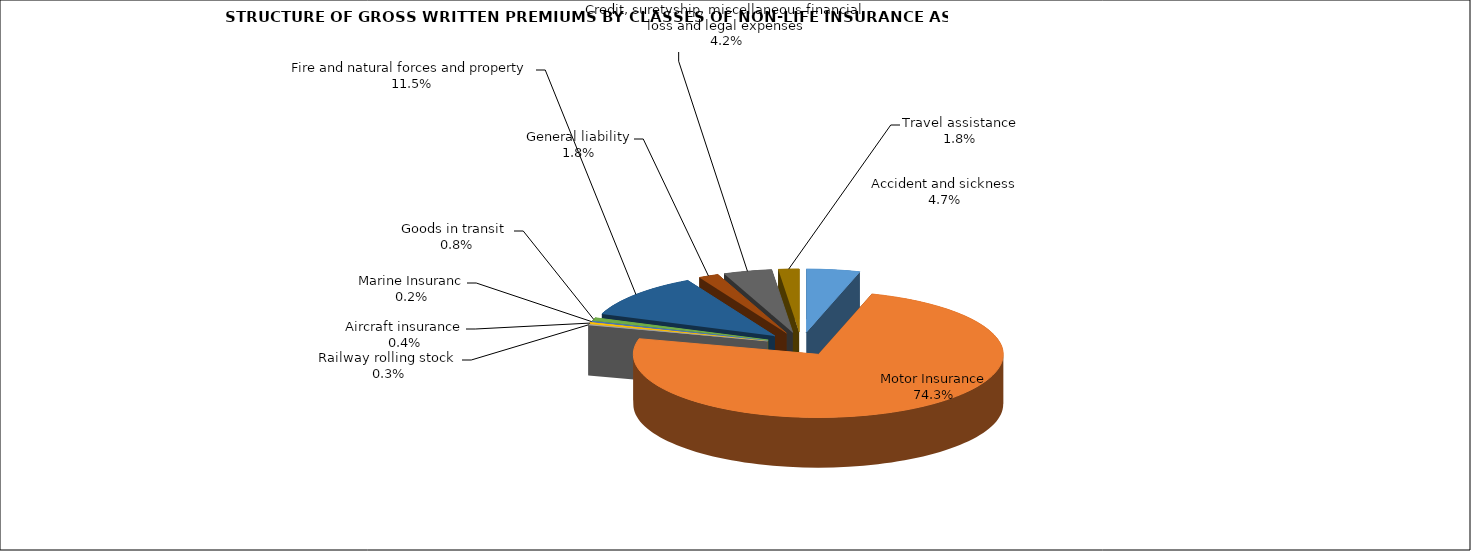
| Category | Accident and sickness |
|---|---|
| Accident and sickness | 0.047 |
| Motor Insurance | 0.743 |
| Railway rolling stock  | 0.003 |
| Aircraft insurance | 0.004 |
| Marine Insuranc | 0.002 |
| Goods in transit  | 0.008 |
| Fire and natural forces and property | 0.115 |
| General liability | 0.018 |
| Credit, suretyship, miscellaneous financial loss and legal expenses | 0.042 |
| Travel assistance | 0.018 |